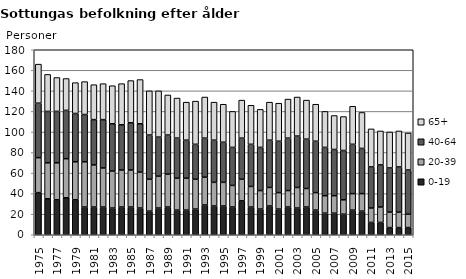
| Category | 0-19 | 20-39 | 40-64 | 65+ |
|---|---|---|---|---|
| 1975.0 | 41 | 34 | 53 | 38 |
| 1976.0 | 35 | 35 | 50 | 36 |
| 1977.0 | 34 | 36 | 50 | 33 |
| 1978.0 | 36 | 38 | 47 | 31 |
| 1979.0 | 34 | 37 | 47 | 30 |
| 1980.0 | 27 | 44 | 46 | 32 |
| 1981.0 | 27 | 41 | 44 | 34 |
| 1982.0 | 27 | 38 | 47 | 35 |
| 1983.0 | 26 | 36 | 46 | 37 |
| 1984.0 | 27 | 36 | 44 | 40 |
| 1985.0 | 27 | 36 | 46 | 41 |
| 1986.0 | 26 | 35 | 47 | 43 |
| 1987.0 | 23 | 31 | 43 | 43 |
| 1988.0 | 26 | 31 | 38 | 45 |
| 1989.0 | 27 | 32 | 38 | 39 |
| 1990.0 | 24 | 31 | 39 | 39 |
| 1991.0 | 24 | 31 | 37 | 37 |
| 1992.0 | 25 | 29 | 34 | 42 |
| 1993.0 | 29 | 27 | 38 | 40 |
| 1994.0 | 28 | 23 | 41 | 37 |
| 1995.0 | 28 | 23 | 39 | 37 |
| 1996.0 | 27 | 21 | 37 | 35 |
| 1997.0 | 33 | 21 | 40 | 37 |
| 1998.0 | 27 | 20 | 41 | 38 |
| 1999.0 | 25 | 18 | 42 | 37 |
| 2000.0 | 28 | 18 | 46 | 37 |
| 2001.0 | 25 | 16 | 50 | 37 |
| 2002.0 | 27 | 16 | 51 | 38 |
| 2003.0 | 26 | 20 | 50 | 38 |
| 2004.0 | 27 | 18 | 48 | 38 |
| 2005.0 | 24 | 17 | 50 | 36 |
| 2006.0 | 21 | 17 | 47 | 35 |
| 2007.0 | 21 | 17 | 45 | 33 |
| 2008.0 | 20 | 14 | 48 | 33 |
| 2009.0 | 24 | 16 | 48 | 37 |
| 2010.0 | 23 | 17 | 44 | 35 |
| 2011.0 | 12 | 14 | 40 | 37 |
| 2012.0 | 12 | 15 | 41 | 33 |
| 2013.0 | 7 | 15 | 43 | 35 |
| 2014.0 | 7 | 15 | 44 | 35 |
| 2015.0 | 7 | 13 | 43 | 36 |